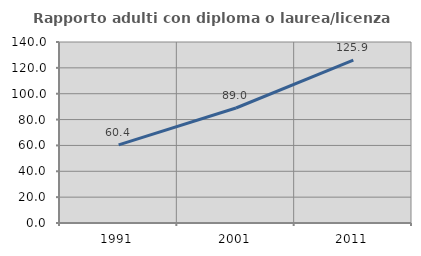
| Category | Rapporto adulti con diploma o laurea/licenza media  |
|---|---|
| 1991.0 | 60.417 |
| 2001.0 | 88.961 |
| 2011.0 | 125.931 |